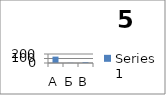
| Category | Series 0 |
|---|---|
| А | 142 |
| Б | 4 |
| В | 18 |